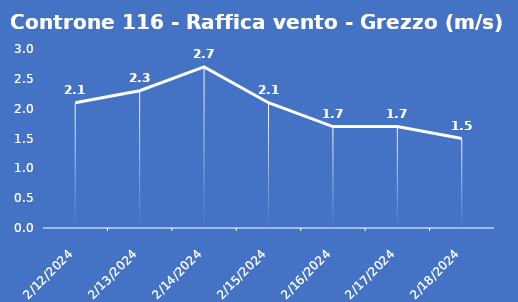
| Category | Controne 116 - Raffica vento - Grezzo (m/s) |
|---|---|
| 2/12/24 | 2.1 |
| 2/13/24 | 2.3 |
| 2/14/24 | 2.7 |
| 2/15/24 | 2.1 |
| 2/16/24 | 1.7 |
| 2/17/24 | 1.7 |
| 2/18/24 | 1.5 |